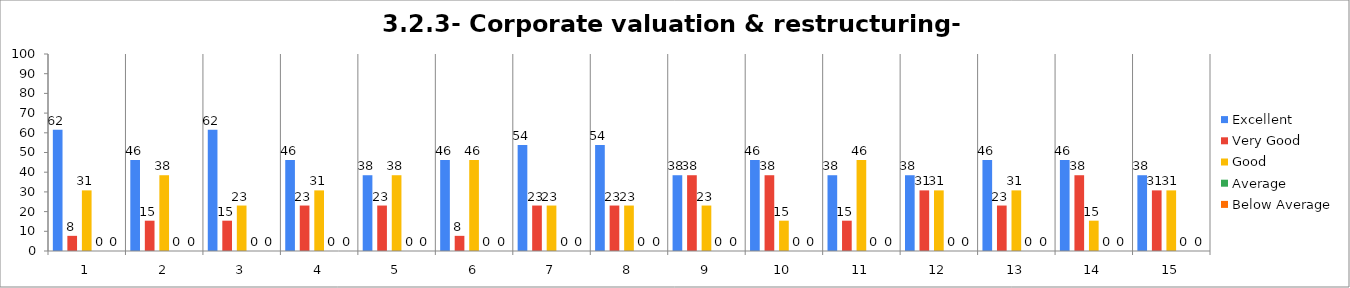
| Category | Excellent | Very Good | Good | Average | Below Average |
|---|---|---|---|---|---|
| 0 | 61.538 | 7.692 | 30.769 | 0 | 0 |
| 1 | 46.154 | 15.385 | 38.462 | 0 | 0 |
| 2 | 61.538 | 15.385 | 23.077 | 0 | 0 |
| 3 | 46.154 | 23.077 | 30.769 | 0 | 0 |
| 4 | 38.462 | 23.077 | 38.462 | 0 | 0 |
| 5 | 46.154 | 7.692 | 46.154 | 0 | 0 |
| 6 | 53.846 | 23.077 | 23.077 | 0 | 0 |
| 7 | 53.846 | 23.077 | 23.077 | 0 | 0 |
| 8 | 38.462 | 38.462 | 23.077 | 0 | 0 |
| 9 | 46.154 | 38.462 | 15.385 | 0 | 0 |
| 10 | 38.462 | 15.385 | 46.154 | 0 | 0 |
| 11 | 38.462 | 30.769 | 30.769 | 0 | 0 |
| 12 | 46.154 | 23.077 | 30.769 | 0 | 0 |
| 13 | 46.154 | 38.462 | 15.385 | 0 | 0 |
| 14 | 38.462 | 30.769 | 30.769 | 0 | 0 |